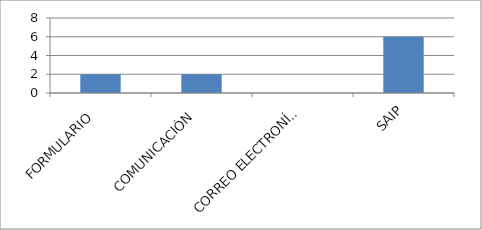
| Category | Series 0 |
|---|---|
| FORMULARIO  | 2 |
| COMUNICACIÓN  | 2 |
| CORREO ELECTRONÍCO  | 0 |
| SAIP | 6 |